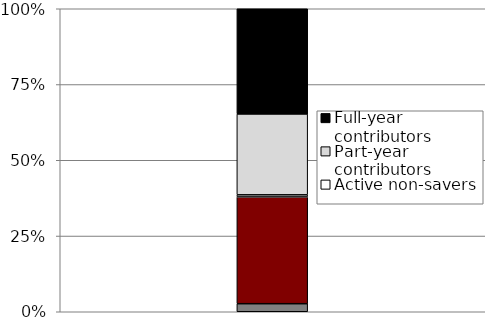
| Category | Full-year inactives | Job changers | Active non-savers | Part-year contributors | Full-year contributors |
|---|---|---|---|---|---|
| 0 | 0.027 | 0.352 | 0.007 | 0.267 | 0.347 |